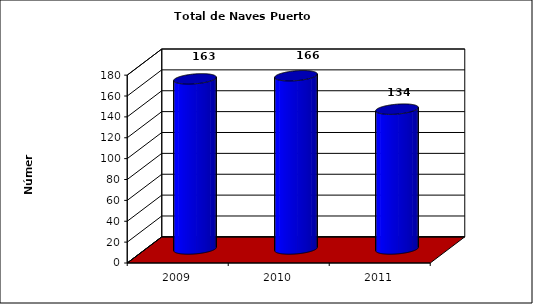
| Category | Series 0 |
|---|---|
| 2009.0 | 163 |
| 2010.0 | 166 |
| 2011.0 | 134 |